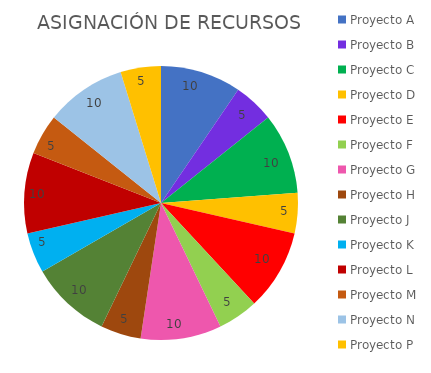
| Category | Series 0 |
|---|---|
| Proyecto A | 10 |
| Proyecto B | 5 |
| Proyecto C | 10 |
| Proyecto D | 5 |
| Proyecto E | 10 |
| Proyecto F | 5 |
| Proyecto G | 10 |
| Proyecto H | 5 |
| Proyecto J | 10 |
| Proyecto K | 5 |
| Proyecto L | 10 |
| Proyecto M | 5 |
| Proyecto N | 10 |
| Proyecto P | 5 |